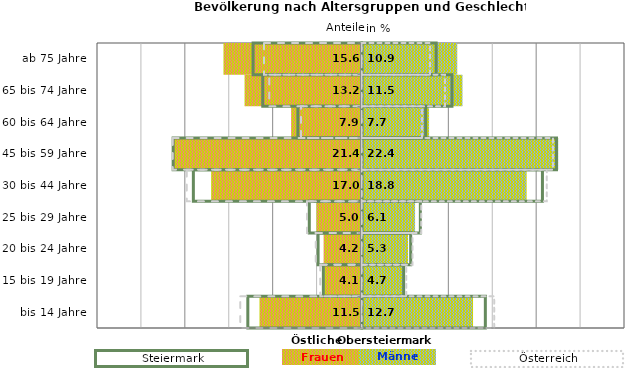
| Category | Frauen | Männer | Frauen Spalte2 | Männer Spalte2 | Frauen Spalte3 | Männer Spalte3 |
|---|---|---|---|---|---|---|
| bis 14 Jahre | -11.5 | 12.7 | 14.1 | -13 | -13.8 | 15.1 |
| 15 bis 19 Jahre | -4.1 | 4.7 | 4.8 | -4.4 | -4.7 | 5.1 |
| 20 bis 24 Jahre | -4.2 | 5.3 | 5.6 | -5 | -5.2 | 5.8 |
| 25 bis 29 Jahre | -5 | 6.1 | 6.7 | -6 | -6.2 | 6.8 |
| 30 bis 44 Jahre | -17 | 18.8 | 20.6 | -19.2 | -19.9 | 21.1 |
| 45 bis 59 Jahre | -21.4 | 22.4 | 22.2 | -21.5 | -21.5 | 21.8 |
| 60 bis 64 Jahre | -7.9 | 7.7 | 7.3 | -7.3 | -6.9 | 6.9 |
| 65 bis 74 Jahre | -13.2 | 11.5 | 10.3 | -11.3 | -10.5 | 9.5 |
| ab 75 Jahre | -15.6 | 10.9 | 8.5 | -12.4 | -11.1 | 7.8 |